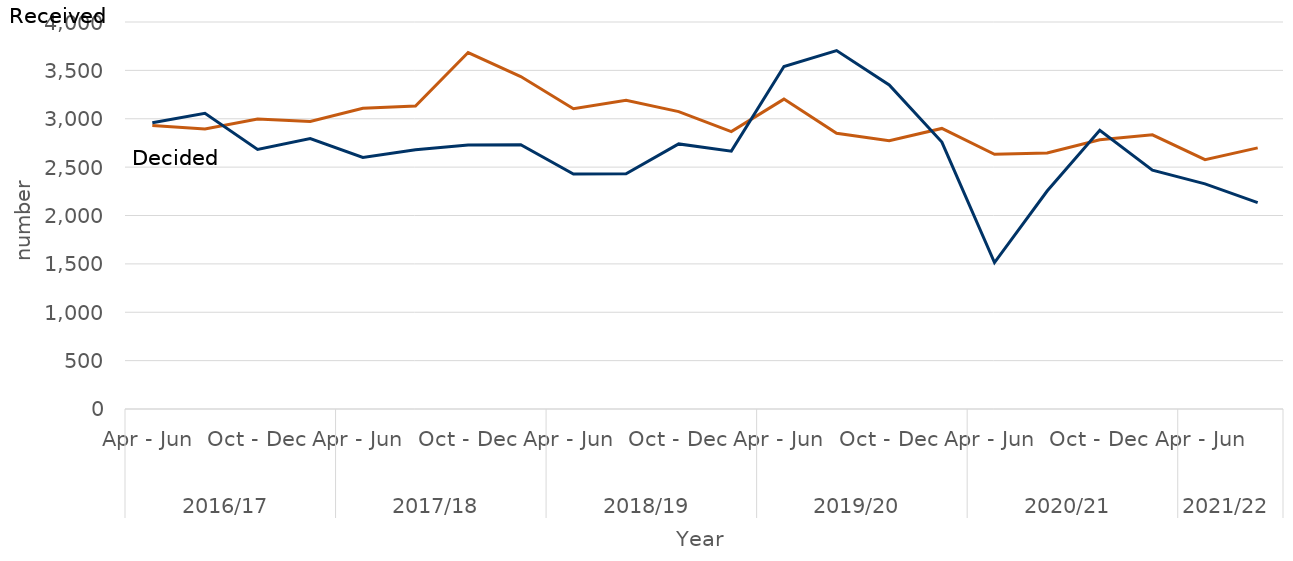
| Category | received | decided |
|---|---|---|
| 0 | 2929 | 2958 |
| 1 | 2895 | 3056 |
| 2 | 2997 | 2683 |
| 3 | 2972 | 2796 |
| 4 | 3108 | 2600 |
| 5 | 3131 | 2680 |
| 6 | 3684 | 2728 |
| 7 | 3436 | 2731 |
| 8 | 3104 | 2428 |
| 9 | 3192 | 2431 |
| 10 | 3074 | 2740 |
| 11 | 2867 | 2665 |
| 12 | 3203 | 3540 |
| 13 | 2849 | 3705 |
| 14 | 2772 | 3350 |
| 15 | 2900 | 2759 |
| 16 | 2632 | 1514 |
| 17 | 2647 | 2253 |
| 18 | 2783 | 2880 |
| 19 | 2834 | 2468 |
| 20 | 2577 | 2327 |
| 21 | 2699 | 2133 |